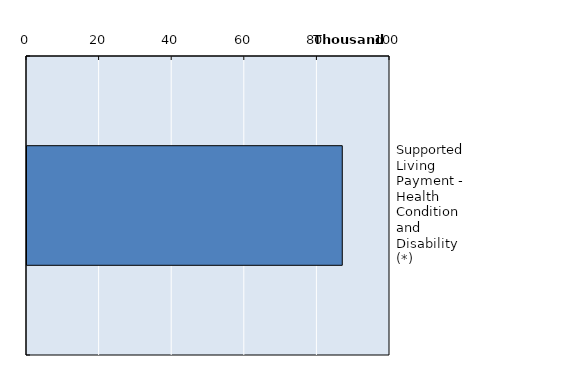
| Category | Series 0 |
|---|---|
| Supported Living Payment - Health Condition and Disability (*) | 86851 |